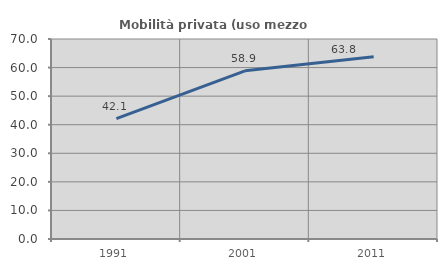
| Category | Mobilità privata (uso mezzo privato) |
|---|---|
| 1991.0 | 42.116 |
| 2001.0 | 58.875 |
| 2011.0 | 63.794 |